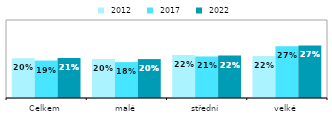
| Category |  2012 |  2017 |  2022 |
|---|---|---|---|
| Celkem | 0.204 | 0.192 | 0.205 |
| malé | 0.2 | 0.184 | 0.199 |
| střední | 0.221 | 0.213 | 0.217 |
| velké | 0.215 | 0.265 | 0.27 |